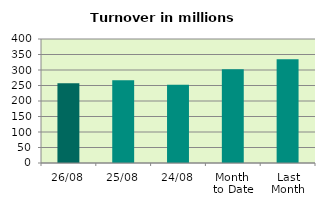
| Category | Series 0 |
|---|---|
| 26/08 | 257.646 |
| 25/08 | 266.55 |
| 24/08 | 252.708 |
| Month 
to Date | 302.11 |
| Last
Month | 334.97 |